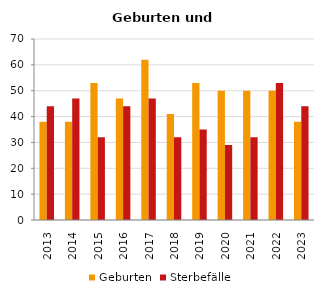
| Category | Geburten | Sterbefälle |
|---|---|---|
| 2013.0 | 38 | 44 |
| 2014.0 | 38 | 47 |
| 2015.0 | 53 | 32 |
| 2016.0 | 47 | 44 |
| 2017.0 | 62 | 47 |
| 2018.0 | 41 | 32 |
| 2019.0 | 53 | 35 |
| 2020.0 | 50 | 29 |
| 2021.0 | 50 | 32 |
| 2022.0 | 50 | 53 |
| 2023.0 | 38 | 44 |